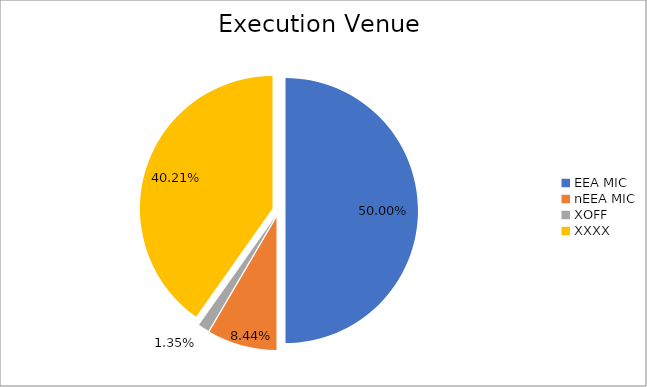
| Category | Series 0 |
|---|---|
| EEA MIC | 6542366.924 |
| nEEA MIC | 1104031.781 |
| XOFF | 177168.057 |
| XXXX | 5261753.181 |